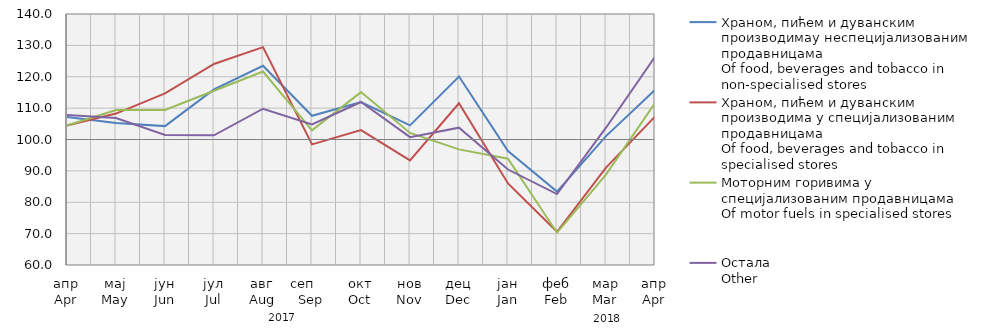
| Category | Храном, пићем и дуванским производимау неспецијализованим продавницама
Of food, beverages and tobacco in non-specialised stores
 | Храном, пићем и дуванским производима у специјализовaним продавницама
Of food, beverages and tobacco in specialised stores | Моторним горивима у специјализованим продавницама
Of motor fuels in specialised stores | Остала
Other |
|---|---|---|---|---|
| апр
Apr | 107.187 | 104.456 | 104.458 | 107.78 |
| мај
May | 105.292 | 108.265 | 109.385 | 106.843 |
| јун
Jun | 104.266 | 114.686 | 109.425 | 101.464 |
| јул
Jul | 115.952 | 124.078 | 115.551 | 101.353 |
| авг
Aug | 123.494 | 129.435 | 121.673 | 109.807 |
| сеп     Sep | 107.568 | 98.457 | 102.908 | 104.789 |
| окт
Oct | 111.938 | 102.999 | 115.109 | 111.951 |
| нов
Nov | 104.514 | 93.335 | 102.083 | 100.762 |
| дец
Dec | 120.059 | 111.537 | 96.853 | 103.773 |
| јан
Jan | 96.298 | 85.996 | 93.873 | 90.431 |
| феб
Feb | 83.4 | 70.6 | 70.3 | 82.6 |
| мар
Mar | 101.078 | 91.052 | 88.818 | 103.76 |
| апр
Apr | 115.827 | 107.304 | 111.624 | 126.386 |